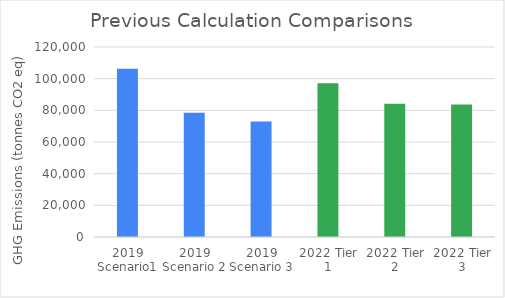
| Category | Series 0 |
|---|---|
| 2019 Scenario1 | 106311 |
| 2019 Scenario 2 | 78469 |
| 2019 Scenario 3 | 72936 |
| 2022 Tier 1 | 97147.582 |
| 2022 Tier 2 | 84165.244 |
| 2022 Tier 3 | 83679.234 |